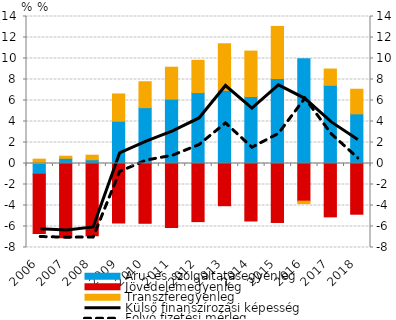
| Category | Áru- és szolgáltatásegyenleg | Jövedelemegyenleg | Transzferegyenleg |
|---|---|---|---|
| 2006.0 | -1.021 | -5.647 | 0.414 |
| 2007.0 | 0.494 | -7.066 | 0.2 |
| 2008.0 | 0.357 | -6.883 | 0.435 |
| 2009.0 | 4.031 | -5.668 | 2.592 |
| 2010.0 | 5.32 | -5.693 | 2.467 |
| 2011.0 | 6.129 | -6.106 | 3.042 |
| 2012.0 | 6.755 | -5.534 | 3.07 |
| 2013.0 | 6.963 | -4.021 | 4.438 |
| 2014.0 | 6.377 | -5.477 | 4.329 |
| 2015.0 | 8.094 | -5.616 | 4.961 |
| 2016.0 | 9.982 | -3.583 | -0.238 |
| 2017.0 | 7.448 | -5.083 | 1.549 |
| 2018.0 | 4.729 | -4.83 | 2.345 |